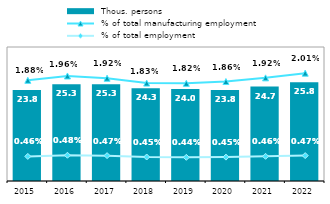
| Category |  Thous. persons |
|---|---|
| 2015.0 | 23.771 |
| 2016.0 | 25.292 |
| 2017.0 | 25.298 |
| 2018.0 | 24.253 |
| 2019.0 | 24.001 |
| 2020.0 | 23.777 |
| 2021.0 | 24.669 |
| 2022.0 | 25.771 |